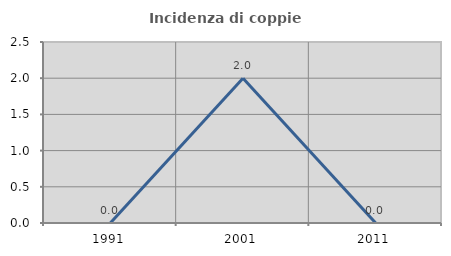
| Category | Incidenza di coppie miste |
|---|---|
| 1991.0 | 0 |
| 2001.0 | 2 |
| 2011.0 | 0 |